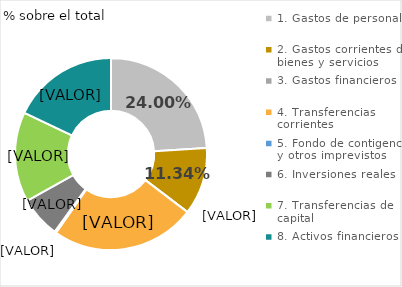
| Category | Series 0 |
|---|---|
| 1. Servicios públicos básicos | 0.07 |
| 2. Actuaciones de protección y promoción social | 0.127 |
| 3. Producción de bienes públicos de carácter preferente | 0.15 |
| 4. Actuaciones de carácter económico  | 0.148 |
| 9. Actuaciones de carácter general | 0.505 |